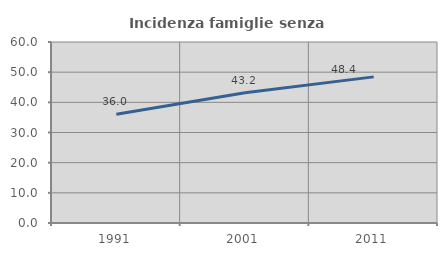
| Category | Incidenza famiglie senza nuclei |
|---|---|
| 1991.0 | 36.041 |
| 2001.0 | 43.204 |
| 2011.0 | 48.438 |